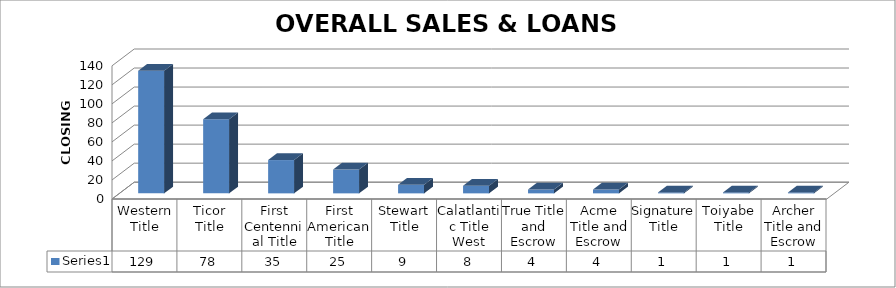
| Category | Series 0 |
|---|---|
| Western Title | 129 |
| Ticor Title | 78 |
| First Centennial Title | 35 |
| First American Title | 25 |
| Stewart Title | 9 |
| Calatlantic Title West | 8 |
| True Title and Escrow | 4 |
| Acme Title and Escrow | 4 |
| Signature Title | 1 |
| Toiyabe Title | 1 |
| Archer Title and Escrow | 1 |